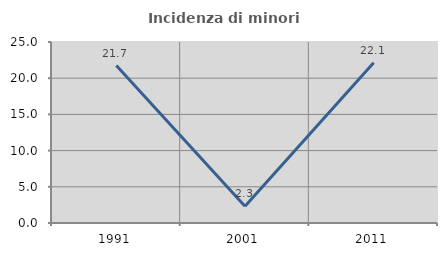
| Category | Incidenza di minori stranieri |
|---|---|
| 1991.0 | 21.739 |
| 2001.0 | 2.326 |
| 2011.0 | 22.124 |